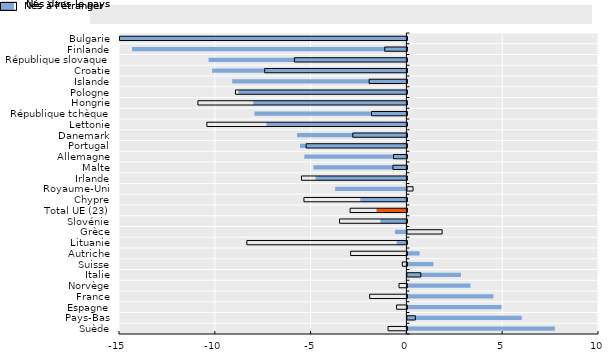
| Category | Nés à l’étranger | Nés dans le pays |
|---|---|---|
| Suède | 7.697 | -0.984 |
| Pays-Bas | 5.967 | 0.416 |
| Espagne | 4.913 | -0.54 |
| France | 4.492 | -1.943 |
| Norvège | 3.294 | -0.411 |
| Italie | 2.796 | 0.699 |
| Suisse | 1.36 | -0.239 |
| Autriche | 0.636 | -2.94 |
| Lituanie | -0.502 | -8.352 |
| Grèce | -0.599 | 1.814 |
| Slovénie | -1.361 | -3.516 |
| Total UE (23) | -1.559 | -2.963 |
| Chypre | -2.408 | -5.375 |
| Royaume-Uni | -3.72 | 0.294 |
| Irlande | -4.74 | -5.503 |
| Malte | -4.853 | -0.729 |
| Allemagne | -5.328 | -0.698 |
| Portugal | -5.554 | -5.261 |
| Danemark | -5.707 | -2.825 |
| Lettonie | -7.304 | -10.44 |
| République tchèque | -7.932 | -1.846 |
| Hongrie | -7.99 | -10.908 |
| Pologne | -8.768 | -8.949 |
| Islande | -9.089 | -1.971 |
| Croatie | -10.14 | -7.422 |
| République slovaque | -10.324 | -5.874 |
| Finlande | -14.319 | -1.156 |
| Bulgarie | -15.341 | -16.341 |